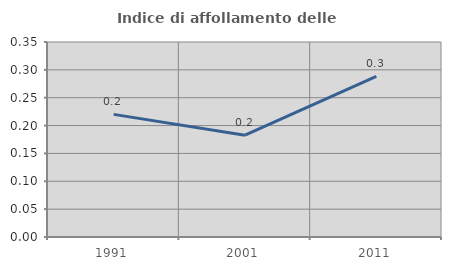
| Category | Indice di affollamento delle abitazioni  |
|---|---|
| 1991.0 | 0.22 |
| 2001.0 | 0.183 |
| 2011.0 | 0.288 |